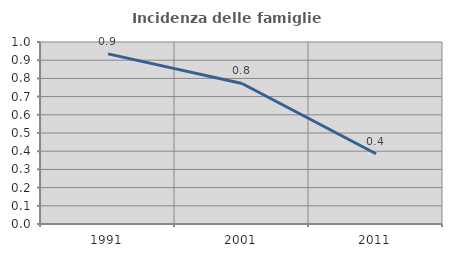
| Category | Incidenza delle famiglie numerose |
|---|---|
| 1991.0 | 0.935 |
| 2001.0 | 0.772 |
| 2011.0 | 0.386 |